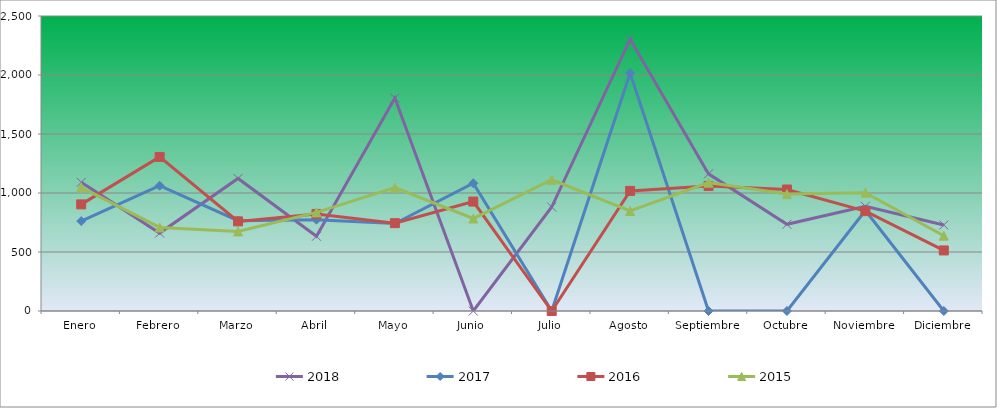
| Category | 2018 | 2017 | 2016 | 2015 |
|---|---|---|---|---|
| Enero | 1090.305 | 762.227 | 903.487 | 1048.353 |
| Febrero | 660.157 | 1061.78 | 1305.705 | 708.018 |
| Marzo | 1123.164 | 765.193 | 759.41 | 674.592 |
| Abril | 633.273 | 774.091 | 822.444 | 835.644 |
| Mayo | 1804.231 | 741.466 | 744.402 | 1045.314 |
| Junio | 0 | 1082.541 | 927.5 | 783.986 |
| Julio | 881.206 | 0 | 0 | 1112.166 |
| Agosto | 2303.083 | 2016.788 | 1017.549 | 847.798 |
| Septiembre | 1161.997 | 0 | 1059.572 | 1087.856 |
| Octubre | 734.836 | 0 | 1029.556 | 990.617 |
| Noviembre | 887.18 | 851.203 | 846.457 | 1002.772 |
| Diciembre | 728.862 | 0 | 513.277 | 638.128 |